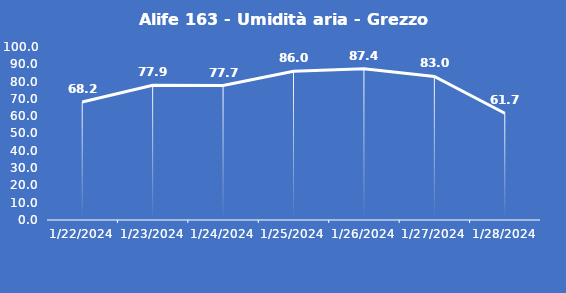
| Category | Alife 163 - Umidità aria - Grezzo (%) |
|---|---|
| 1/22/24 | 68.2 |
| 1/23/24 | 77.9 |
| 1/24/24 | 77.7 |
| 1/25/24 | 86 |
| 1/26/24 | 87.4 |
| 1/27/24 | 83 |
| 1/28/24 | 61.7 |